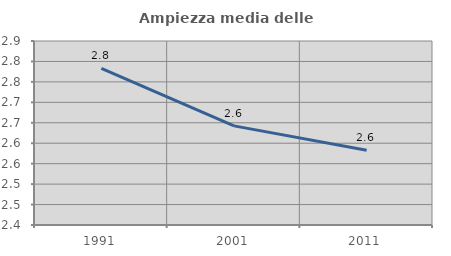
| Category | Ampiezza media delle famiglie |
|---|---|
| 1991.0 | 2.783 |
| 2001.0 | 2.642 |
| 2011.0 | 2.583 |